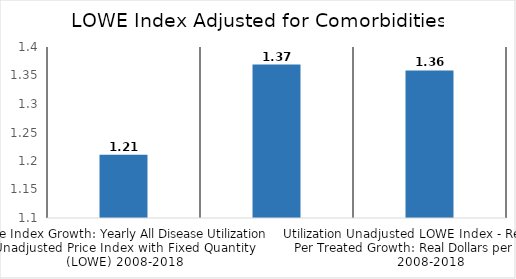
| Category | All Disease |
|---|---|
| Price Index Growth: Yearly All Disease Utilization Unadjusted Price Index with Fixed Quantity (LOWE) 2008-2018 | 1.211 |
| Real Utilization Unadjusted LOWE Growth in 2008 dollars: Nominal Expenditure Growth / LOWE Index Growth | 1.369 |
| Utilization Unadjusted LOWE Index - Real Output Per Treated Growth: Real Dollars per Treated 2008-2018 | 1.359 |